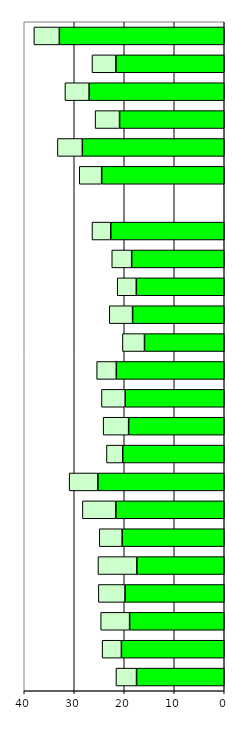
| Category | Series 0 | Series 1 |
|---|---|---|
| 0 | 17.543 | 4.115 |
| 1 | 20.571 | 3.857 |
| 2 | 18.927 | 5.787 |
| 3 | 19.841 | 5.337 |
| 4 | 17.478 | 7.778 |
| 5 | 20.416 | 4.576 |
| 6 | 21.674 | 6.697 |
| 7 | 25.269 | 5.747 |
| 8 | 20.303 | 3.255 |
| 9 | 19.122 | 5.099 |
| 10 | 19.805 | 4.75 |
| 11 | 21.585 | 3.932 |
| 12 | 15.951 | 4.409 |
| 13 | 18.333 | 4.655 |
| 14 | 17.588 | 3.82 |
| 15 | 18.511 | 3.983 |
| 16 | 22.699 | 3.75 |
| 17 | 0 | 0 |
| 18 | 24.518 | 4.479 |
| 19 | 28.379 | 4.99 |
| 20 | 20.936 | 4.894 |
| 21 | 27.025 | 4.839 |
| 22 | 21.664 | 4.791 |
| 23 | 32.981 | 5.092 |